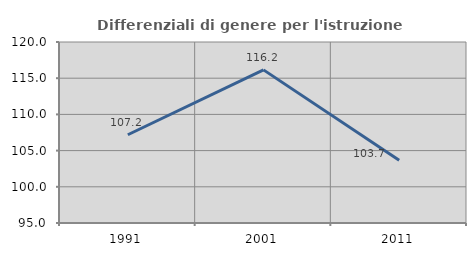
| Category | Differenziali di genere per l'istruzione superiore |
|---|---|
| 1991.0 | 107.187 |
| 2001.0 | 116.15 |
| 2011.0 | 103.653 |